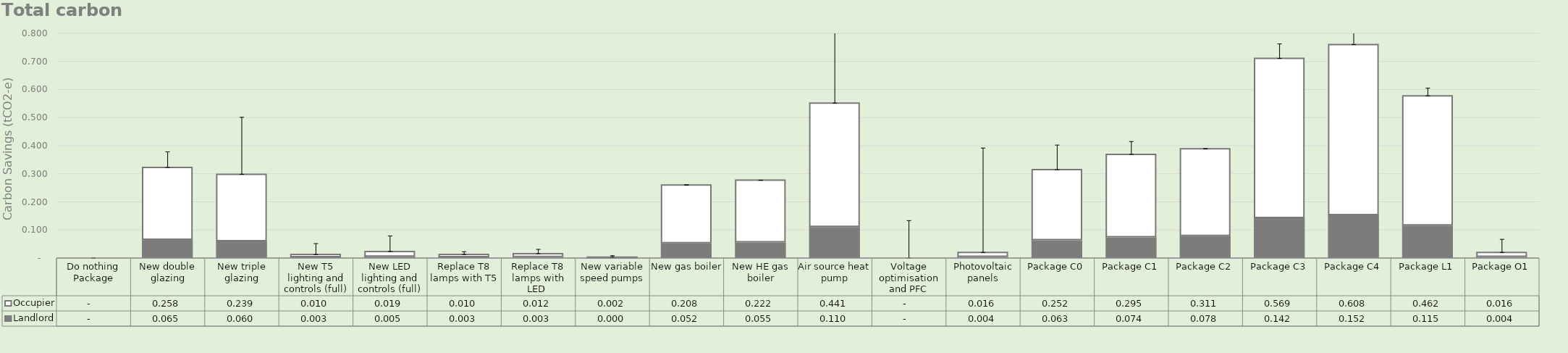
| Category | Landlord | Occupier |
|---|---|---|
| Do nothing Package | 0 | 0 |
| New double glazing | 0.065 | 0.258 |
| New triple glazing | 0.06 | 0.239 |
| New T5 lighting and controls (full) | 0.003 | 0.01 |
| New LED lighting and controls (full) | 0.005 | 0.019 |
| Replace T8 lamps with T5 | 0.003 | 0.01 |
| Replace T8 lamps with LED  | 0.003 | 0.012 |
| New variable speed pumps | 0 | 0.002 |
| New gas boiler | 0.052 | 0.208 |
| New HE gas boiler | 0.055 | 0.222 |
| Air source heat pump | 0.11 | 0.441 |
| Voltage optimisation and PFC | 0 | 0 |
| Photovoltaic panels | 0.004 | 0.016 |
| Package C0 | 0.063 | 0.252 |
| Package C1 | 0.074 | 0.295 |
| Package C2 | 0.078 | 0.311 |
| Package C3 | 0.142 | 0.569 |
| Package C4 | 0.152 | 0.608 |
| Package L1 | 0.115 | 0.462 |
| Package O1 | 0.004 | 0.016 |